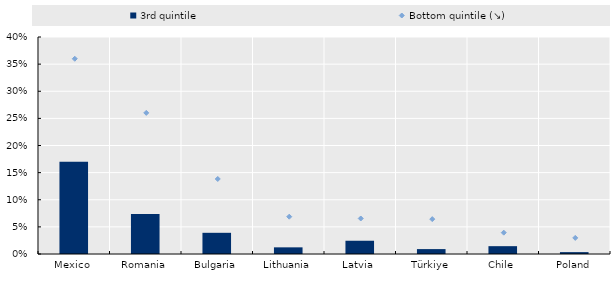
| Category | 3rd quintile |
|---|---|
| Mexico | 0.17 |
| Romania | 0.074 |
| Bulgaria | 0.039 |
| Lithuania | 0.012 |
| Latvia | 0.024 |
| Türkiye | 0.009 |
| Chile | 0.014 |
| Poland | 0.003 |